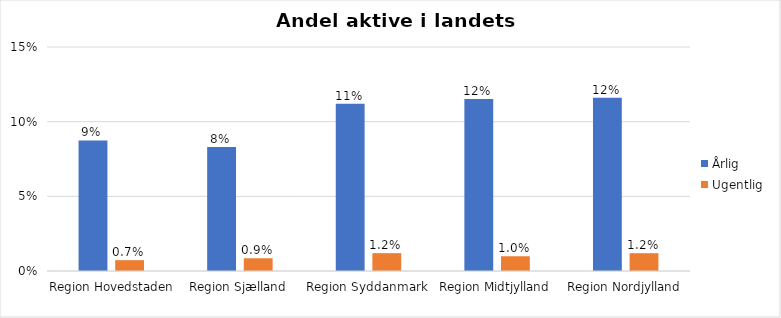
| Category | Årlig | Ugentlig |
|---|---|---|
| Region Hovedstaden | 0.087 | 0.007 |
| Region Sjælland | 0.083 | 0.009 |
| Region Syddanmark | 0.112 | 0.012 |
| Region Midtjylland | 0.115 | 0.01 |
| Region Nordjylland | 0.116 | 0.012 |